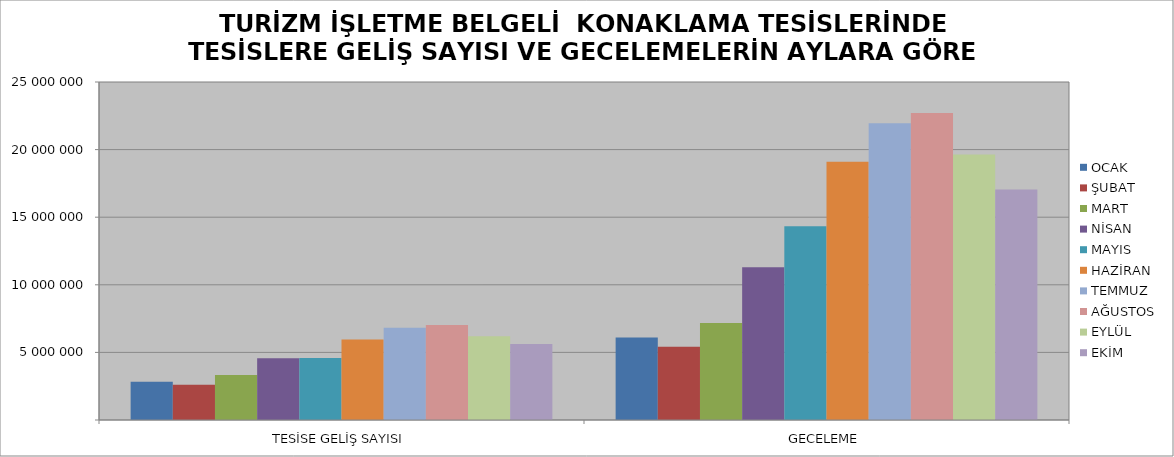
| Category | OCAK | ŞUBAT | MART | NİSAN | MAYIS | HAZİRAN | TEMMUZ | AĞUSTOS | EYLÜL | EKİM |
|---|---|---|---|---|---|---|---|---|---|---|
| TESİSE GELİŞ SAYISI | 2833509 | 2607189 | 3326719 | 4561709 | 4585981 | 5949977 | 6830740 | 7020795 | 6189605 | 5614434 |
| GECELEME | 6098050 | 5425989 | 7182593 | 11302946 | 14338328 | 19092571 | 21955256 | 22706728 | 19635859 | 17054807 |